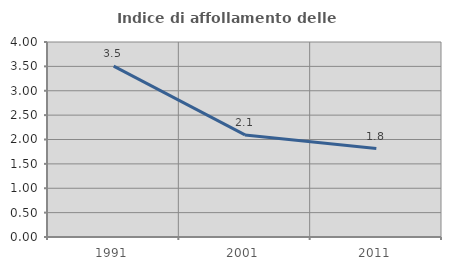
| Category | Indice di affollamento delle abitazioni  |
|---|---|
| 1991.0 | 3.505 |
| 2001.0 | 2.095 |
| 2011.0 | 1.814 |